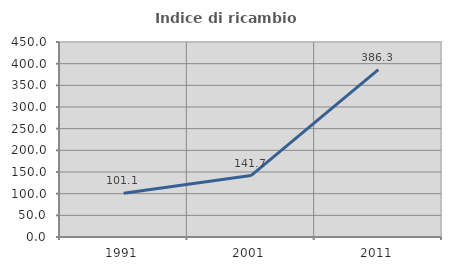
| Category | Indice di ricambio occupazionale  |
|---|---|
| 1991.0 | 101.136 |
| 2001.0 | 141.718 |
| 2011.0 | 386.275 |